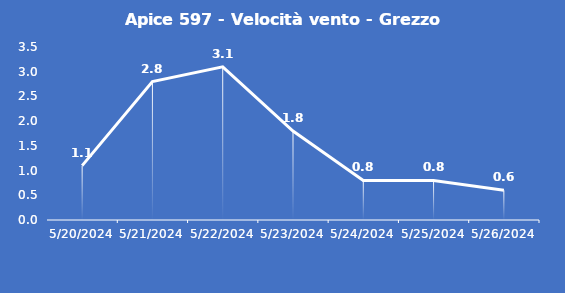
| Category | Apice 597 - Velocità vento - Grezzo (m/s) |
|---|---|
| 5/20/24 | 1.1 |
| 5/21/24 | 2.8 |
| 5/22/24 | 3.1 |
| 5/23/24 | 1.8 |
| 5/24/24 | 0.8 |
| 5/25/24 | 0.8 |
| 5/26/24 | 0.6 |